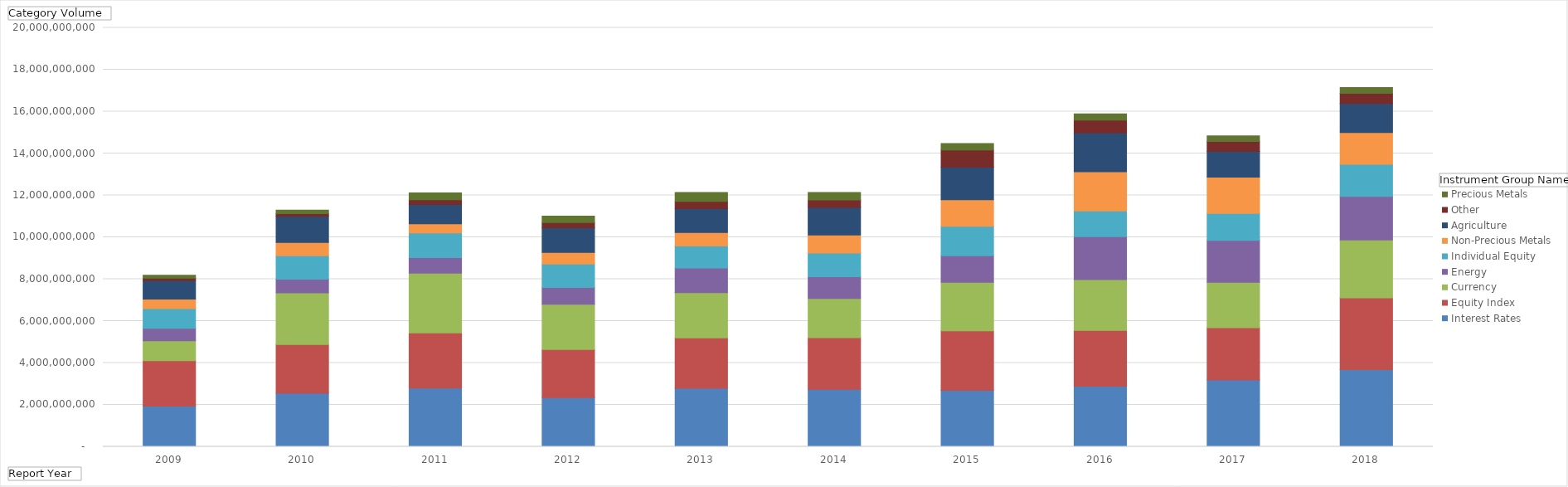
| Category | Interest Rates | Equity Index | Currency | Energy | Individual Equity | Non-Precious Metals | Agriculture | Other | Precious Metals |
|---|---|---|---|---|---|---|---|---|---|
| 2009 | 1939888358 | 2167056883 | 949686453 | 592168318 | 946540945 | 457337968 | 882474399 | 114149410 | 139330358 |
| 2010 | 2549758778 | 2326805450 | 2470156132 | 650861264 | 1116394508 | 635808794 | 1246098041 | 137330081 | 164960958 |
| 2011 | 2800799608 | 2639410039 | 2850374184 | 734774891 | 1186720739 | 426989496 | 924446137 | 229929364 | 328686467 |
| 2012 | 2348533730 | 2292201830 | 2161161693 | 804146283 | 1118605869 | 547697133 | 1178986766 | 252914437 | 307238983 |
| 2013 | 2787470491 | 2406894969 | 2166688327 | 1174091622 | 1050287791 | 639531429 | 1145041000 | 345712901 | 420270980 |
| 2014 | 2740328394 | 2466518861 | 1876489532 | 1032164877 | 1133966665 | 863913936 | 1313292954 | 354145006 | 360055723 |
| 2015 | 2695835976 | 2838065373 | 2314122921 | 1269410203 | 1403535660 | 1271618946 | 1558690408 | 819448633 | 307466746 |
| 2016 | 2886602018 | 2671284748 | 2418085793 | 2057483642 | 1226265187 | 1866900446 | 1849423109 | 615715499 | 300333194 |
| 2017 | 3183614340 | 2503986040 | 2163244504 | 2005411206 | 1284275104 | 1729732237 | 1225769281 | 479534666 | 267185790 |
| 2018 | 3679707538 | 3430695777 | 2763215221 | 2075971481 | 1536958051 | 1512575089 | 1386838479 | 488714934 | 276642827 |